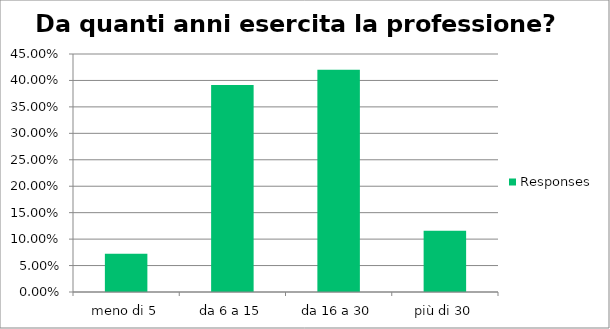
| Category | Responses |
|---|---|
| meno di 5 | 0.072 |
| da 6 a 15 | 0.391 |
| da 16 a 30 | 0.42 |
| più di 30 | 0.116 |